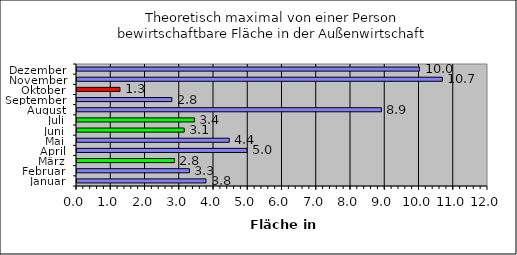
| Category | Maximal bewirtschaftbare Fläche Außenwirtschaft |
|---|---|
| Januar | 3.765 |
| Februar | 3.282 |
| März | 2.844 |
| April | 4.966 |
| Mai | 4.444 |
| Juni | 3.13 |
| Juli | 3.429 |
| August | 8.889 |
| September | 2.769 |
| Oktober | 1.255 |
| November | 10.667 |
| Dezember | 10 |